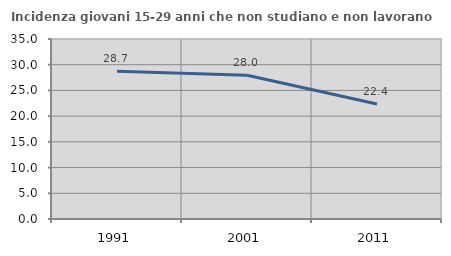
| Category | Incidenza giovani 15-29 anni che non studiano e non lavorano  |
|---|---|
| 1991.0 | 28.716 |
| 2001.0 | 27.964 |
| 2011.0 | 22.353 |